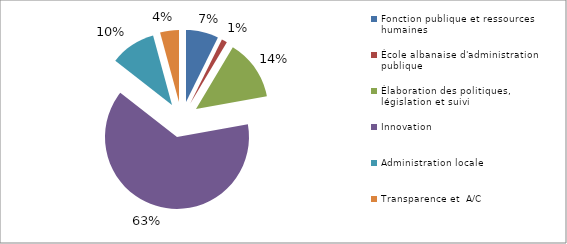
| Category | Series 0 |
|---|---|
| Fonction publique et ressources humaines  | 5819425 |
| École albanaise d'administration publique | 989131 |
| Élaboration des politiques, législation et suivi | 10852580.4 |
| Innovation  | 50483328 |
| Administration locale | 8127900 |
| Transparence et  A/C  | 3372150 |